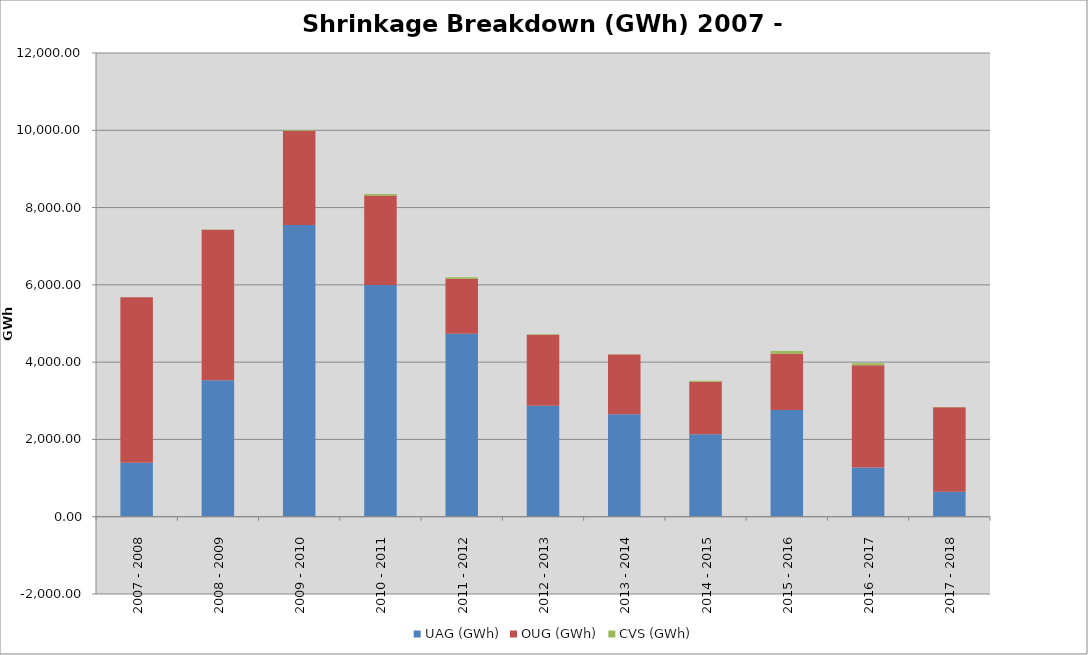
| Category | UAG (GWh) | OUG (GWh) | CVS (GWh) |
|---|---|---|---|
| 2007 - 2008 | 1398.285 | 4278.392 | -4.579 |
| 2008 - 2009 | 3530.957 | 3893.886 | 7.733 |
| 2009 - 2010 | 7550.984 | 2436.968 | 21.544 |
| 2010 - 2011 | 5995.931 | 2316.569 | 41.687 |
| 2011 - 2012 | 4736.63 | 1420.093 | 42.855 |
| 2012 - 2013 | 2873.58 | 1834.959 | 15.137 |
| 2013 - 2014 | 2651.042 | 1548.032 | 5.803 |
| 2014 - 2015 | 2131.938 | 1357.73 | 27.039 |
| 2015 - 2016 | 2761.773 | 1457.817 | 70.93 |
| 2016 - 2017 | 1271.669 | 2649.964 | 50.614 |
| 2017 - 2018 | 643.285 | 2187.924 | 9.718 |